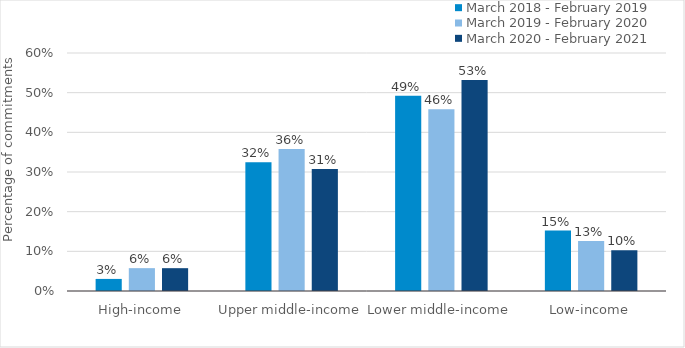
| Category | March 2018 - February 2019 | March 2019 - February 2020 | March 2020 - February 2021 |
|---|---|---|---|
| High-income | 0.03 | 0.058 | 0.058 |
| Upper middle-income | 0.325 | 0.358 | 0.308 |
| Lower middle-income | 0.492 | 0.458 | 0.532 |
| Low-income | 0.152 | 0.126 | 0.103 |